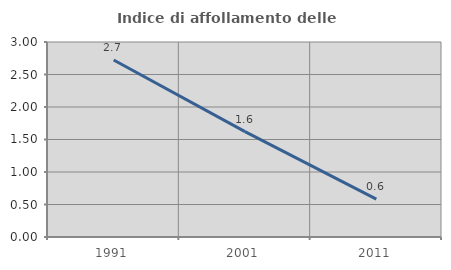
| Category | Indice di affollamento delle abitazioni  |
|---|---|
| 1991.0 | 2.722 |
| 2001.0 | 1.621 |
| 2011.0 | 0.584 |